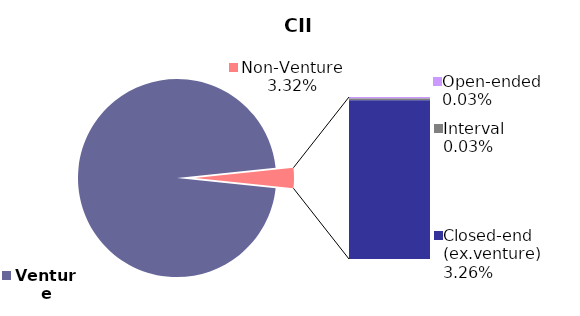
| Category | 31.03.2018 |
|---|---|
| Venture | 0.967 |
| Open-ended | 0 |
| Interval | 0 |
| Closed-end (ex.venture) | 0.033 |